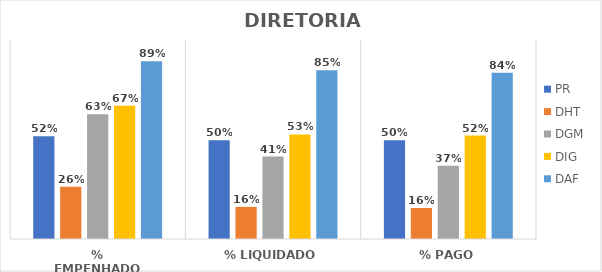
| Category | PR | DHT | DGM | DIG | DAF |
|---|---|---|---|---|---|
| % EMPENHADO | 0.516 | 0.262 | 0.627 | 0.669 | 0.893 |
| % LIQUIDADO | 0.497 | 0.161 | 0.414 | 0.525 | 0.848 |
| % PAGO | 0.497 | 0.156 | 0.368 | 0.52 | 0.835 |